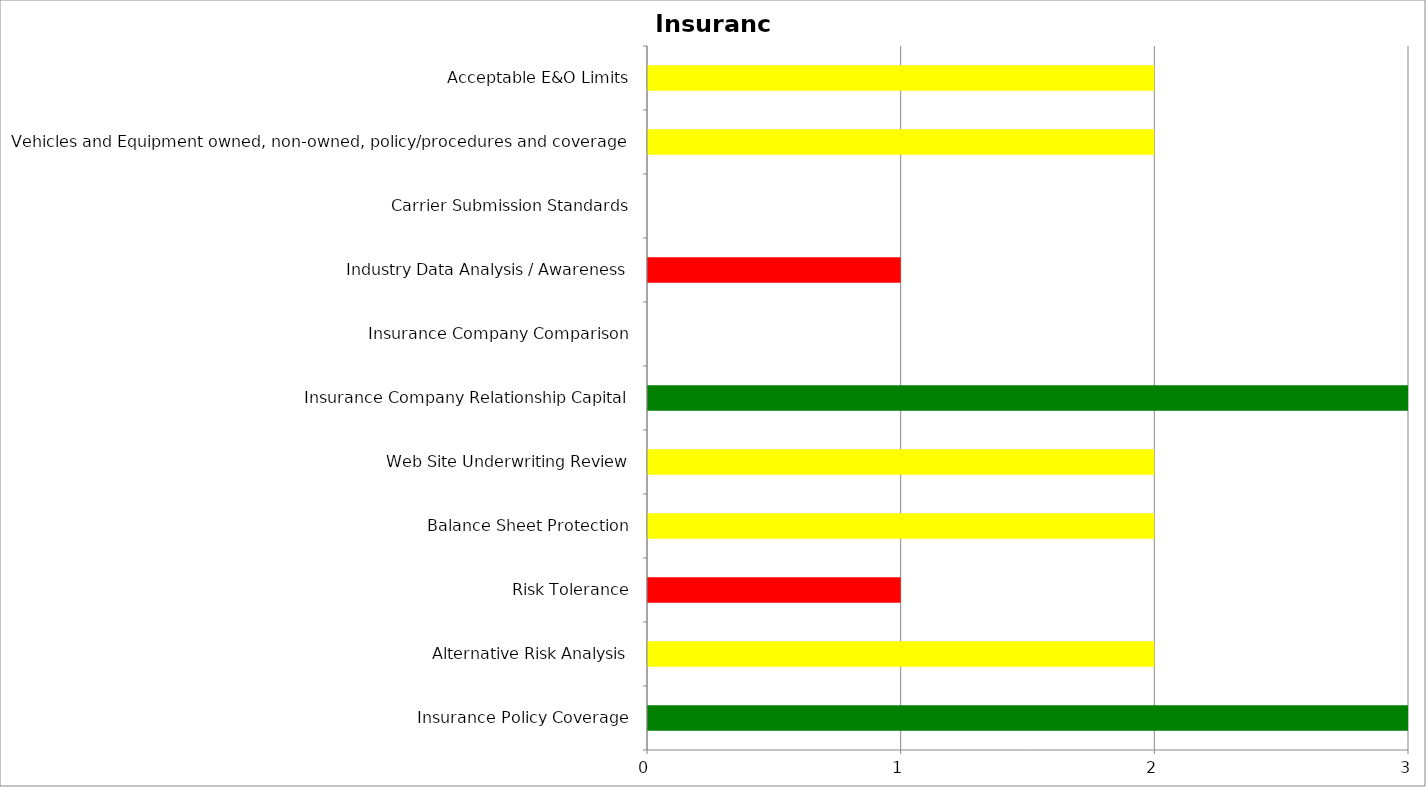
| Category | Low | Medium | High |
|---|---|---|---|
| Insurance Policy Coverage | 3 | 0 | 0 |
| Alternative Risk Analysis | 0 | 2 | 0 |
| Risk Tolerance | 0 | 0 | 1 |
| Balance Sheet Protection | 0 | 2 | 0 |
| Web Site Underwriting Review | 0 | 2 | 0 |
| Insurance Company Relationship Capital | 3 | 0 | 0 |
| Insurance Company Comparison | 0 | 0 | 0 |
| Industry Data Analysis / Awareness | 0 | 0 | 1 |
| Carrier Submission Standards | 0 | 0 | 0 |
| Vehicles and Equipment owned, non-owned, policy/procedures and coverage | 0 | 2 | 0 |
| Acceptable E&O Limits | 0 | 2 | 0 |